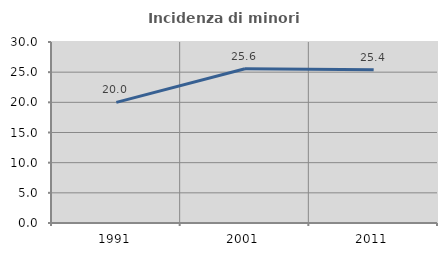
| Category | Incidenza di minori stranieri |
|---|---|
| 1991.0 | 20 |
| 2001.0 | 25.556 |
| 2011.0 | 25.389 |